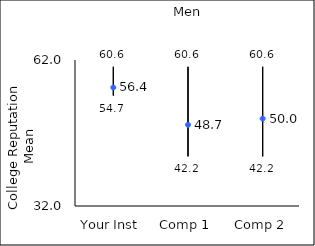
| Category | 25th percentile | 75th percentile | Mean |
|---|---|---|---|
| Your Inst | 54.7 | 60.6 | 56.35 |
| Comp 1 | 42.2 | 60.6 | 48.68 |
| Comp 2 | 42.2 | 60.6 | 49.95 |